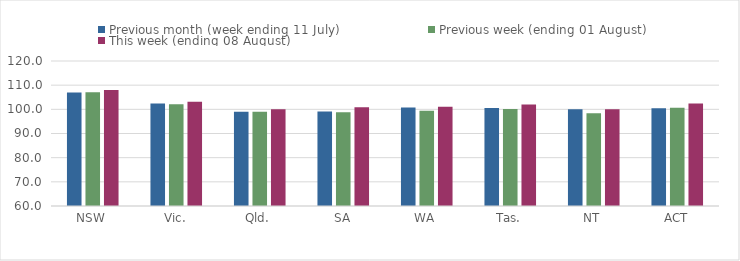
| Category | Previous month (week ending 11 July) | Previous week (ending 01 August) | This week (ending 08 August) |
|---|---|---|---|
| NSW | 106.961 | 107.114 | 108.004 |
| Vic. | 102.453 | 102.121 | 103.189 |
| Qld. | 99.032 | 98.984 | 100.07 |
| SA | 99.058 | 98.781 | 100.873 |
| WA | 100.719 | 99.463 | 101.092 |
| Tas. | 100.578 | 100.108 | 102.037 |
| NT | 100 | 98.426 | 100.017 |
| ACT | 100.423 | 100.634 | 102.431 |